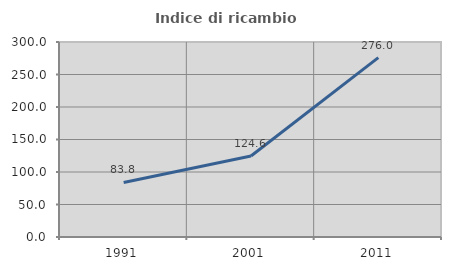
| Category | Indice di ricambio occupazionale  |
|---|---|
| 1991.0 | 83.847 |
| 2001.0 | 124.576 |
| 2011.0 | 275.967 |